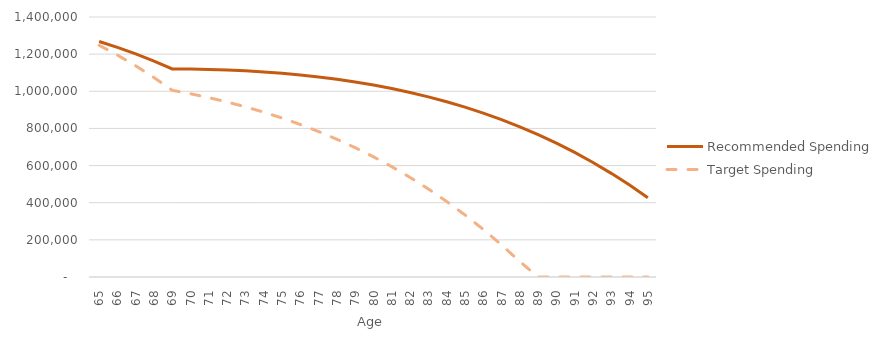
| Category | Recommended Spending | Target Spending |
|---|---|---|
| 65.0 | 1267803.884 | 1247783.845 |
| 66.0 | 1236300.519 | 1194859.038 |
| 67.0 | 1201324.114 | 1136981.711 |
| 68.0 | 1162663.061 | 1073858.112 |
| 69.0 | 1120094.409 | 1005178.879 |
| 70.0 | 1119420.529 | 986562.378 |
| 71.0 | 1117579.383 | 965637.543 |
| 72.0 | 1114489.936 | 942261.407 |
| 73.0 | 1110066.648 | 916283.304 |
| 74.0 | 1104219.24 | 887544.473 |
| 75.0 | 1096852.447 | 855877.64 |
| 76.0 | 1087865.759 | 821106.584 |
| 77.0 | 1077153.15 | 783045.677 |
| 78.0 | 1064602.793 | 741499.4 |
| 79.0 | 1050096.758 | 696261.837 |
| 80.0 | 1033510.698 | 647116.146 |
| 81.0 | 1014713.517 | 593833.995 |
| 82.0 | 993567.023 | 536174.977 |
| 83.0 | 969925.56 | 473885.993 |
| 84.0 | 943635.628 | 406700.606 |
| 85.0 | 914535.475 | 334338.356 |
| 86.0 | 882454.676 | 256504.047 |
| 87.0 | 847213.685 | 172886.999 |
| 88.0 | 808623.37 | 83160.253 |
| 89.0 | 766484.52 | 0 |
| 90.0 | 720587.326 | 0 |
| 91.0 | 670710.845 | 0 |
| 92.0 | 616622.423 | 0 |
| 93.0 | 558077.1 | 0 |
| 94.0 | 494816.982 | 0 |
| 95.0 | 426570.579 | 0 |